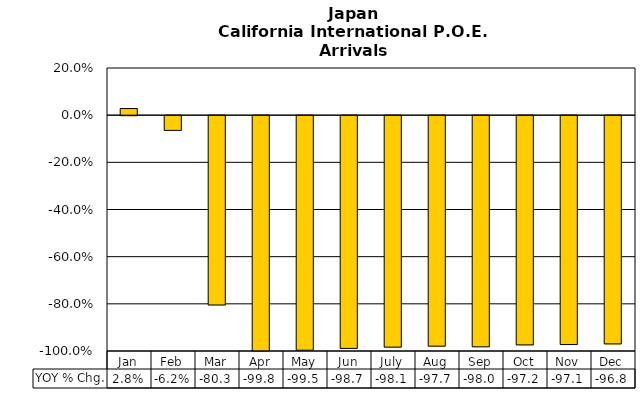
| Category | YOY % Chg. |
|---|---|
| Jan | 0.028 |
| Feb | -0.062 |
| Mar | -0.803 |
| Apr | -0.998 |
| May | -0.995 |
| Jun | -0.987 |
| July | -0.981 |
| Aug | -0.977 |
| Sep | -0.98 |
| Oct | -0.972 |
| Nov | -0.971 |
| Dec | -0.968 |